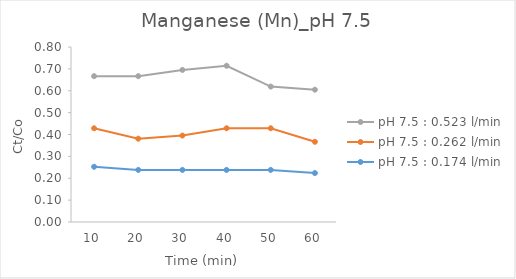
| Category | pH 7.5 : 0.174 l/min | pH 7.5 : 0.262 l/min | pH 7.5 : 0.523 l/min  |
|---|---|---|---|
| 10.0 | 0.252 | 0.176 | 0.238 |
| 20.0 | 0.238 | 0.143 | 0.286 |
| 30.0 | 0.238 | 0.157 | 0.3 |
| 40.0 | 0.238 | 0.19 | 0.286 |
| 50.0 | 0.238 | 0.19 | 0.19 |
| 60.0 | 0.224 | 0.143 | 0.238 |